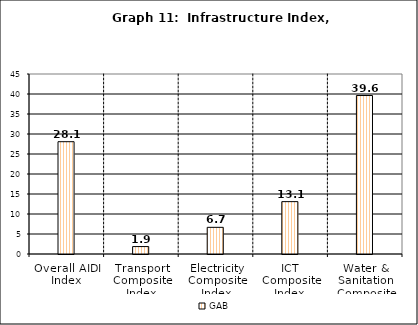
| Category | Series 0 | GAB | Series 2 |
|---|---|---|---|
| Overall AIDI Index |  | 28.076 |  |
| Transport Composite Index |  | 1.859 |  |
| Electricity Composite Index |  | 6.667 |  |
| ICT Composite Index  |  | 13.092 |  |
| Water & Sanitation Composite Index |  | 39.617 |  |